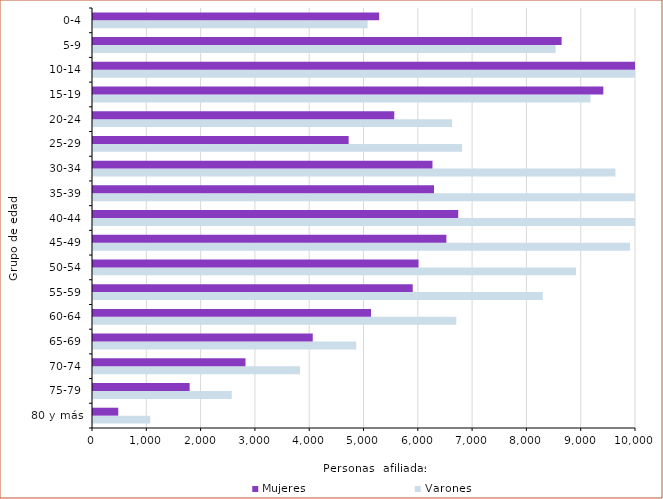
| Category | Varones | Mujeres |
|---|---|---|
| 80 y más | 1054 | 465 |
| 75-79 | 2555 | 1780 |
| 70-74 | 3812 | 2808 |
| 65-69 | 4848 | 4047 |
| 60-64 | 6691 | 5120 |
| 55-59 | 8284 | 5888 |
| 50-54 | 8896 | 5995 |
| 45-49 | 9890 | 6508 |
| 40-44 | 10794 | 6726 |
| 35-39 | 10181 | 6280 |
| 30-34 | 9621 | 6252 |
| 25-29 | 6797 | 4708 |
| 20-24 | 6613 | 5548 |
| 15-19 | 9163 | 9398 |
| 10-14 | 10243 | 10467 |
| 5-9 | 8519 | 8630 |
| 0-4 | 5058 | 5270 |